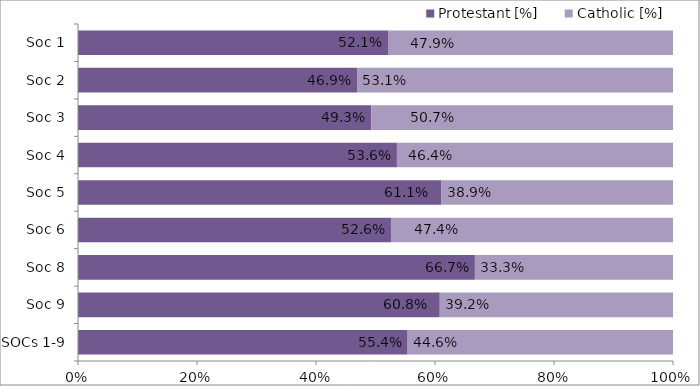
| Category | Protestant | Catholic |
|---|---|---|
| SOCs 1-9 | 0.554 | 0.446 |
| Soc 9 | 0.608 | 0.392 |
| Soc 8 | 0.667 | 0.333 |
| Soc 6 | 0.526 | 0.474 |
| Soc 5 | 0.611 | 0.389 |
| Soc 4 | 0.536 | 0.464 |
| Soc 3 | 0.493 | 0.507 |
| Soc 2 | 0.469 | 0.531 |
| Soc 1 | 0.521 | 0.479 |